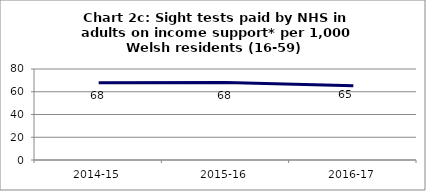
| Category | Chart 2c: Sight tests paid by NHS in adults on income support* per 1,000 Welsh residents (16-59) |
|---|---|
| 2014-15 | 67.887 |
| 2015-16 | 68.091 |
| 2016-17 | 65.314 |